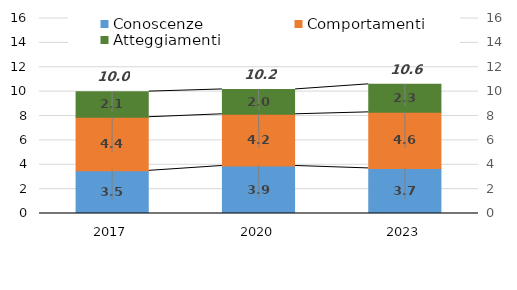
| Category | Conoscenze | Comportamenti | Atteggiamenti |
|---|---|---|---|
| 2017.0 | 3.5 | 4.4 | 2.1 |
| 2020.0 | 3.9 | 4.24 | 2.04 |
| 2023.0 | 3.7 | 4.6 | 2.3 |